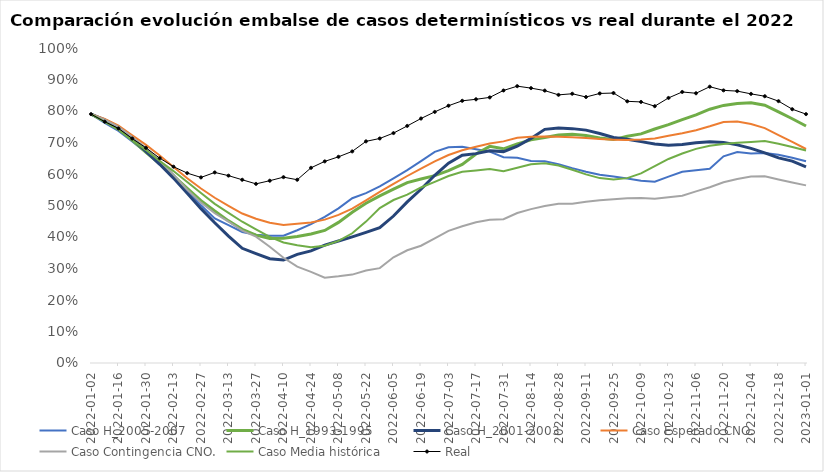
| Category | Caso H_2005-2007 | Caso H_1993-1995 | Caso H_2001-2003 | Caso Esperado CNO. | Caso Contingencia CNO. | Caso Media histórica | Real |
|---|---|---|---|---|---|---|---|
| 2022-01-02 | 0.79 | 0.79 | 0.79 | 0.79 | 0.79 | 0.79 | 0.79 |
| 2022-01-09 | 0.762 | 0.768 | 0.772 | 0.775 | 0.772 | 0.766 | 0.766 |
| 2022-01-16 | 0.737 | 0.743 | 0.748 | 0.754 | 0.749 | 0.741 | 0.745 |
| 2022-01-23 | 0.704 | 0.708 | 0.711 | 0.723 | 0.718 | 0.708 | 0.713 |
| 2022-01-30 | 0.668 | 0.669 | 0.672 | 0.693 | 0.683 | 0.676 | 0.683 |
| 2022-02-06 | 0.638 | 0.632 | 0.631 | 0.659 | 0.643 | 0.641 | 0.65 |
| 2022-02-13 | 0.597 | 0.594 | 0.587 | 0.623 | 0.598 | 0.609 | 0.623 |
| 2022-02-20 | 0.548 | 0.554 | 0.539 | 0.586 | 0.55 | 0.574 | 0.603 |
| 2022-02-27 | 0.501 | 0.515 | 0.49 | 0.554 | 0.509 | 0.539 | 0.589 |
| 2022-03-06 | 0.459 | 0.482 | 0.445 | 0.525 | 0.475 | 0.505 | 0.605 |
| 2022-03-13 | 0.438 | 0.451 | 0.403 | 0.499 | 0.449 | 0.476 | 0.595 |
| 2022-03-20 | 0.416 | 0.424 | 0.364 | 0.475 | 0.42 | 0.448 | 0.582 |
| 2022-03-27 | 0.407 | 0.406 | 0.347 | 0.458 | 0.401 | 0.424 | 0.569 |
| 2022-04-03 | 0.404 | 0.395 | 0.331 | 0.445 | 0.369 | 0.4 | 0.579 |
| 2022-04-10 | 0.404 | 0.396 | 0.327 | 0.438 | 0.334 | 0.383 | 0.59 |
| 2022-04-17 | 0.422 | 0.402 | 0.345 | 0.442 | 0.306 | 0.374 | 0.582 |
| 2022-04-24 | 0.441 | 0.41 | 0.356 | 0.446 | 0.289 | 0.367 | 0.62 |
| 2022-05-01 | 0.464 | 0.421 | 0.374 | 0.455 | 0.271 | 0.373 | 0.64 |
| 2022-05-08 | 0.491 | 0.446 | 0.387 | 0.47 | 0.275 | 0.388 | 0.655 |
| 2022-05-15 | 0.523 | 0.478 | 0.4 | 0.49 | 0.281 | 0.412 | 0.672 |
| 2022-05-22 | 0.539 | 0.507 | 0.415 | 0.516 | 0.293 | 0.449 | 0.704 |
| 2022-05-29 | 0.561 | 0.531 | 0.43 | 0.543 | 0.301 | 0.492 | 0.713 |
| 2022-06-05 | 0.586 | 0.552 | 0.467 | 0.569 | 0.336 | 0.517 | 0.73 |
| 2022-06-12 | 0.612 | 0.573 | 0.511 | 0.594 | 0.358 | 0.534 | 0.753 |
| 2022-06-19 | 0.641 | 0.584 | 0.552 | 0.617 | 0.372 | 0.557 | 0.776 |
| 2022-06-26 | 0.67 | 0.595 | 0.596 | 0.64 | 0.396 | 0.575 | 0.797 |
| 2022-07-03 | 0.685 | 0.611 | 0.634 | 0.66 | 0.42 | 0.594 | 0.817 |
| 2022-07-10 | 0.686 | 0.63 | 0.66 | 0.675 | 0.434 | 0.607 | 0.832 |
| 2022-07-17 | 0.679 | 0.663 | 0.665 | 0.687 | 0.447 | 0.611 | 0.837 |
| 2022-07-24 | 0.671 | 0.688 | 0.674 | 0.697 | 0.455 | 0.616 | 0.843 |
| 2022-07-31 | 0.653 | 0.68 | 0.671 | 0.704 | 0.457 | 0.609 | 0.865 |
| 2022-08-07 | 0.651 | 0.696 | 0.688 | 0.715 | 0.476 | 0.62 | 0.879 |
| 2022-08-14 | 0.641 | 0.708 | 0.713 | 0.718 | 0.489 | 0.631 | 0.873 |
| 2022-08-21 | 0.64 | 0.716 | 0.742 | 0.719 | 0.498 | 0.634 | 0.865 |
| 2022-08-28 | 0.631 | 0.724 | 0.746 | 0.719 | 0.506 | 0.627 | 0.851 |
| 2022-09-04 | 0.619 | 0.726 | 0.744 | 0.717 | 0.506 | 0.614 | 0.855 |
| 2022-09-11 | 0.607 | 0.722 | 0.739 | 0.714 | 0.512 | 0.599 | 0.844 |
| 2022-09-18 | 0.598 | 0.714 | 0.729 | 0.711 | 0.517 | 0.587 | 0.856 |
| 2022-09-25 | 0.592 | 0.709 | 0.716 | 0.709 | 0.52 | 0.583 | 0.857 |
| 2022-10-02 | 0.585 | 0.72 | 0.71 | 0.708 | 0.523 | 0.587 | 0.831 |
| 2022-10-09 | 0.579 | 0.727 | 0.703 | 0.71 | 0.524 | 0.602 | 0.829 |
| 2022-10-16 | 0.576 | 0.743 | 0.696 | 0.713 | 0.522 | 0.625 | 0.815 |
| 2022-10-23 | 0.592 | 0.757 | 0.691 | 0.721 | 0.526 | 0.648 | 0.841 |
| 2022-10-30 | 0.607 | 0.772 | 0.693 | 0.729 | 0.531 | 0.665 | 0.86 |
| 2022-11-06 | 0.612 | 0.788 | 0.699 | 0.739 | 0.545 | 0.68 | 0.856 |
| 2022-11-13 | 0.616 | 0.806 | 0.703 | 0.751 | 0.558 | 0.69 | 0.877 |
| 2022-11-20 | 0.656 | 0.818 | 0.7 | 0.765 | 0.574 | 0.695 | 0.866 |
| 2022-11-27 | 0.67 | 0.824 | 0.692 | 0.766 | 0.584 | 0.699 | 0.863 |
| 2022-12-04 | 0.665 | 0.826 | 0.682 | 0.759 | 0.592 | 0.702 | 0.854 |
| 2022-12-11 | 0.667 | 0.818 | 0.667 | 0.746 | 0.593 | 0.705 | 0.847 |
| 2022-12-18 | 0.661 | 0.797 | 0.651 | 0.723 | 0.583 | 0.696 | 0.831 |
| 2022-12-25 | 0.652 | 0.775 | 0.641 | 0.702 | 0.573 | 0.686 | 0.806 |
| 2023-01-01 | 0.64 | 0.752 | 0.622 | 0.679 | 0.564 | 0.675 | 0.79 |